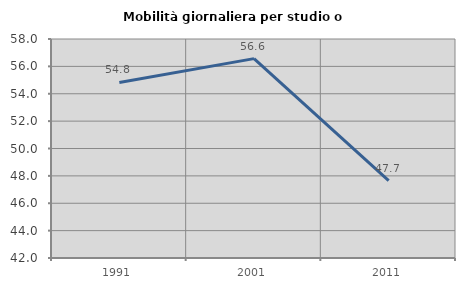
| Category | Mobilità giornaliera per studio o lavoro |
|---|---|
| 1991.0 | 54.825 |
| 2001.0 | 56.566 |
| 2011.0 | 47.654 |